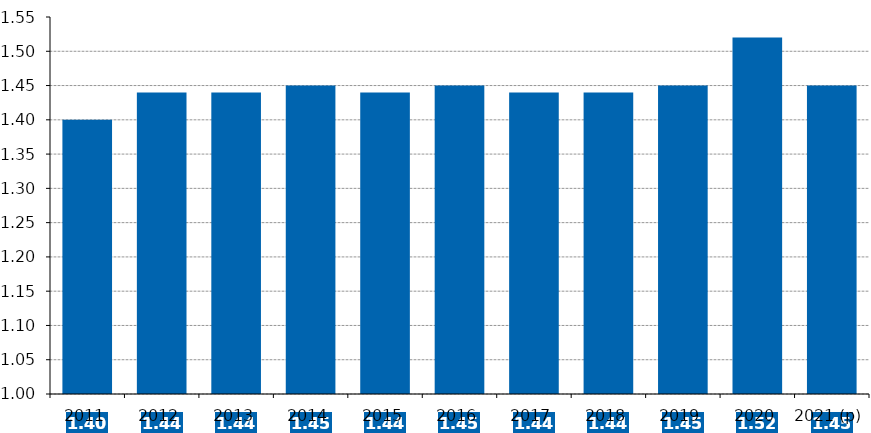
| Category | Dépenses intérieures de R&D des entreprises  |
|---|---|
| 2011 | 1.4 |
| 2012 | 1.44 |
| 2013 | 1.44 |
| 2014 | 1.45 |
| 2015 | 1.44 |
| 2016 | 1.45 |
| 2017 | 1.44 |
| 2018 | 1.44 |
| 2019 | 1.45 |
| 2020 | 1.52 |
| 2021 (p) | 1.45 |